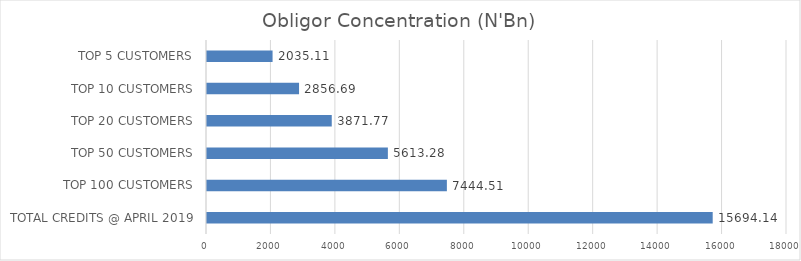
| Category | Series 0 |
|---|---|
| TOTAL CREDITS @ APRIL 2019 | 15694.14 |
| TOP 100 CUSTOMERS | 7444.51 |
| TOP 50 CUSTOMERS | 5613.28 |
| TOP 20 CUSTOMERS | 3871.77 |
| TOP 10 CUSTOMERS | 2856.69 |
| TOP 5 CUSTOMERS | 2035.11 |